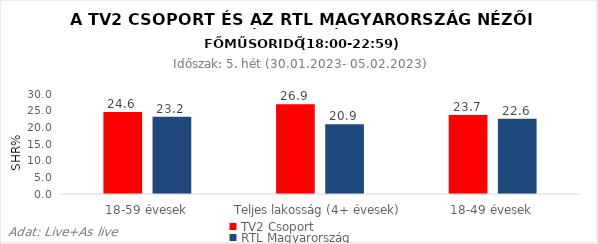
| Category | TV2 Csoport | RTL Magyarország |
|---|---|---|
| 18-59 évesek | 24.6 | 23.2 |
| Teljes lakosság (4+ évesek) | 26.9 | 20.9 |
| 18-49 évesek | 23.7 | 22.6 |